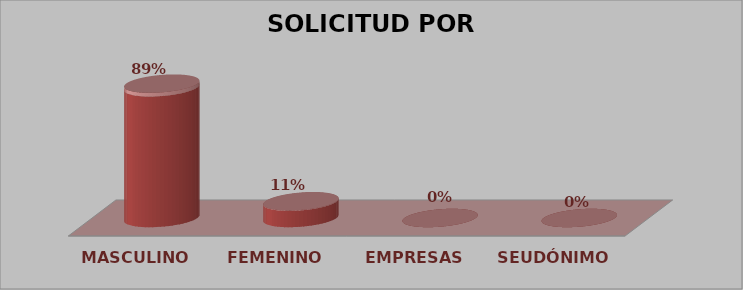
| Category | SOLICITUD POR GÉNERO | Series 1 |
|---|---|---|
| MASCULINO | 32 | 0.889 |
| FEMENINO | 4 | 0.111 |
| EMPRESAS | 0 | 0 |
| SEUDÓNIMO | 0 | 0 |